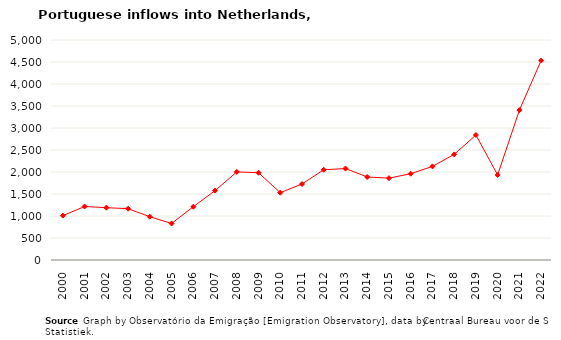
| Category | Entradas |
|---|---|
| 2000.0 | 1009 |
| 2001.0 | 1216 |
| 2002.0 | 1189 |
| 2003.0 | 1166 |
| 2004.0 | 984 |
| 2005.0 | 830 |
| 2006.0 | 1211 |
| 2007.0 | 1577 |
| 2008.0 | 2002 |
| 2009.0 | 1983 |
| 2010.0 | 1530 |
| 2011.0 | 1727 |
| 2012.0 | 2051 |
| 2013.0 | 2079 |
| 2014.0 | 1887 |
| 2015.0 | 1860 |
| 2016.0 | 1961 |
| 2017.0 | 2127 |
| 2018.0 | 2400 |
| 2019.0 | 2841 |
| 2020.0 | 1933 |
| 2021.0 | 3406 |
| 2022.0 | 4533 |